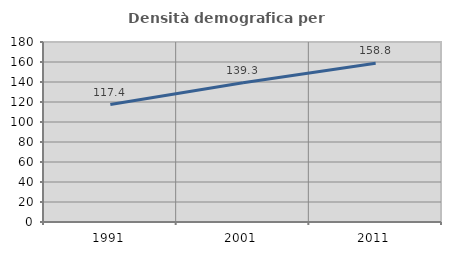
| Category | Densità demografica |
|---|---|
| 1991.0 | 117.445 |
| 2001.0 | 139.293 |
| 2011.0 | 158.834 |